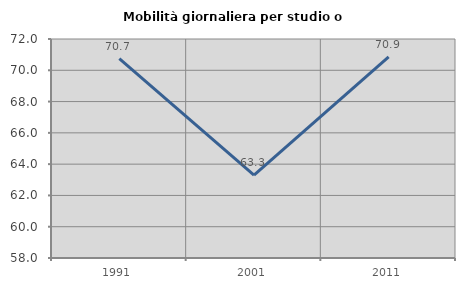
| Category | Mobilità giornaliera per studio o lavoro |
|---|---|
| 1991.0 | 70.747 |
| 2001.0 | 63.298 |
| 2011.0 | 70.854 |